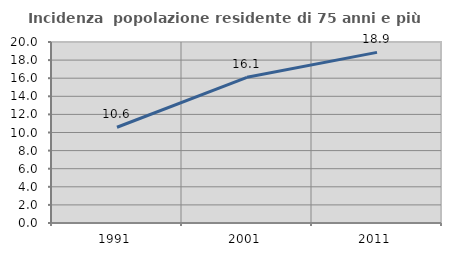
| Category | Incidenza  popolazione residente di 75 anni e più |
|---|---|
| 1991.0 | 10.582 |
| 2001.0 | 16.1 |
| 2011.0 | 18.852 |